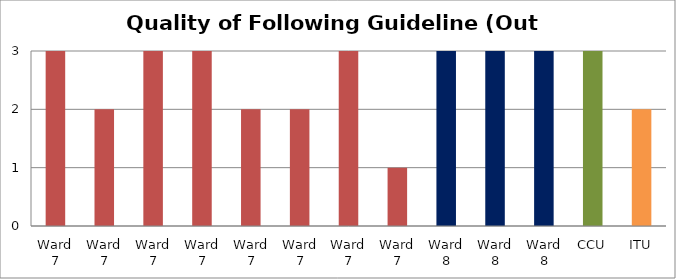
| Category | Score |
|---|---|
| Ward 7 | 3 |
| Ward 7 | 2 |
| Ward 7 | 3 |
| Ward 7 | 3 |
| Ward 7 | 2 |
| Ward 7 | 2 |
| Ward 7 | 3 |
| Ward 7 | 1 |
| Ward 8 | 3 |
| Ward 8 | 3 |
| Ward 8 | 3 |
| CCU | 3 |
| ITU | 2 |